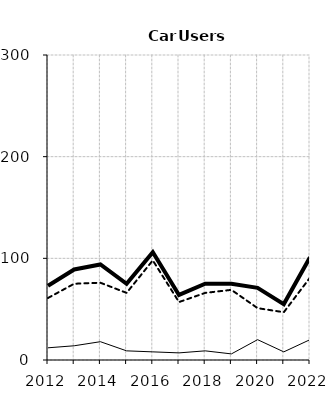
| Category | Built-up | Non built-up | Total |
|---|---|---|---|
| 2012.0 | 12 | 61 | 73 |
| 2013.0 | 14 | 75 | 89 |
| 2014.0 | 18 | 76 | 94 |
| 2015.0 | 9 | 66 | 75 |
| 2016.0 | 8 | 98 | 106 |
| 2017.0 | 7 | 57 | 64 |
| 2018.0 | 9 | 66 | 75 |
| 2019.0 | 6 | 69 | 75 |
| 2020.0 | 20 | 51 | 71 |
| 2021.0 | 8 | 47 | 55 |
| 2022.0 | 20 | 81 | 101 |